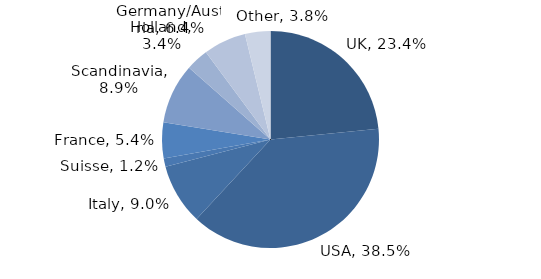
| Category | Investment Style |
|---|---|
| UK | 0.234 |
| USA | 0.385 |
| Italy | 0.09 |
| Suisse | 0.012 |
| France | 0.054 |
| Scandinavia | 0.089 |
| Holland | 0.034 |
| Germany/Austria | 0.064 |
| Other | 0.038 |